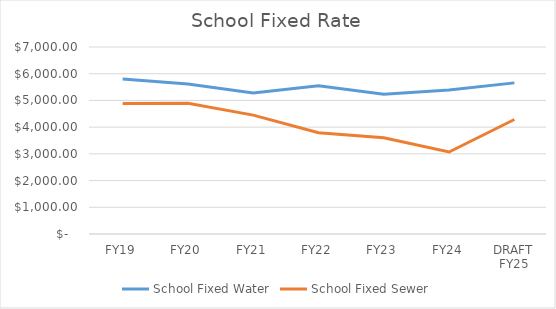
| Category | School Fixed Water | School Fixed Sewer |
|---|---|---|
| FY19 | 5803.97 | 4887.19 |
| FY20 | 5615.143 | 4892.444 |
| FY21 | 5277.83 | 4450.025 |
| FY22 | 5549.135 | 3789.274 |
| FY23 | 5233.025 | 3599.215 |
| FY24 | 5390.784 | 3068.2 |
| DRAFT FY25 | 5657.37 | 4286.24 |